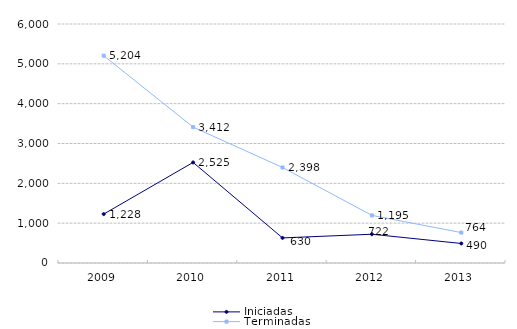
| Category | Iniciadas | Terminadas |
|---|---|---|
| 2009.0 | 1228 | 5204 |
| 2010.0 | 2525 | 3412 |
| 2011.0 | 630 | 2398 |
| 2012.0 | 722 | 1195 |
| 2013.0 | 490 | 764 |